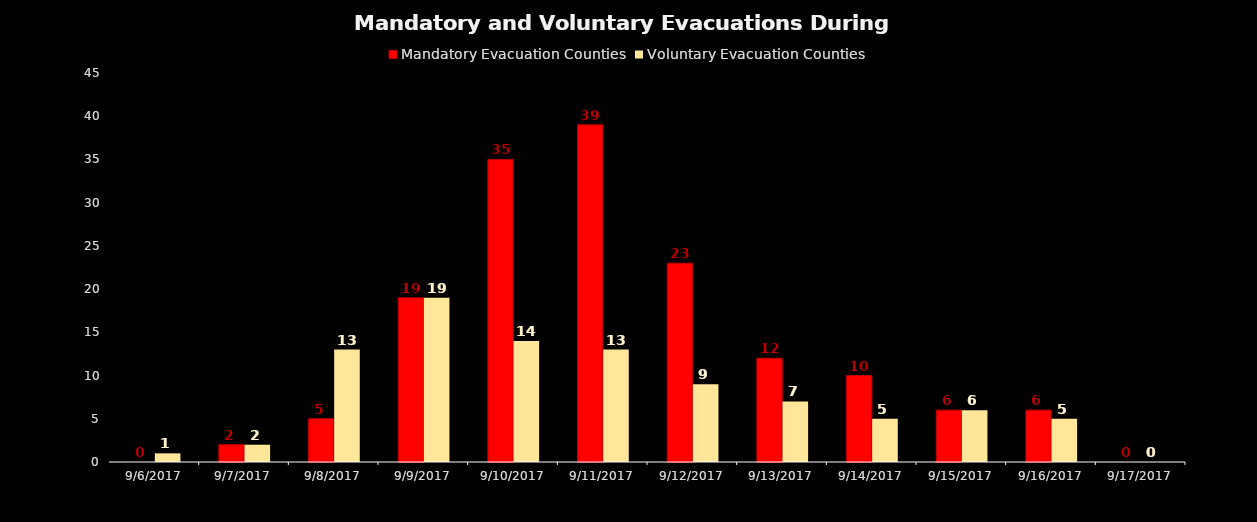
| Category | Mandatory Evacuation Counties | Voluntary Evacuation Counties |
|---|---|---|
| 9/6/17 | 0 | 1 |
| 9/7/17 | 2 | 2 |
| 9/8/17 | 5 | 13 |
| 9/9/17 | 19 | 19 |
| 9/10/17 | 35 | 14 |
| 9/11/17 | 39 | 13 |
| 9/12/17 | 23 | 9 |
| 9/13/17 | 12 | 7 |
| 9/14/17 | 10 | 5 |
| 9/15/17 | 6 | 6 |
| 9/16/17 | 6 | 5 |
| 9/17/17 | 0 | 0 |